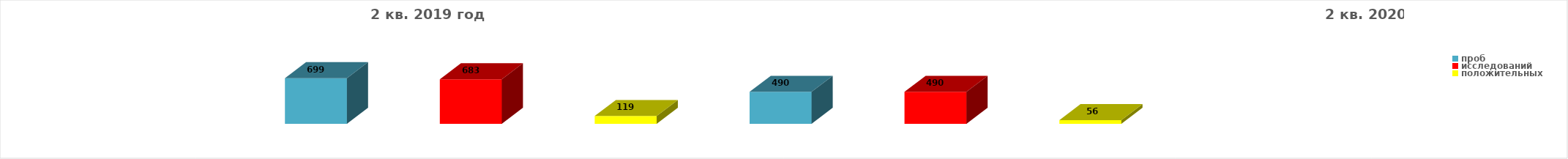
| Category | Series 4 |
|---|---|
| проб | 699 |
| исследований | 683 |
| положительных | 119 |
| проб | 490 |
| исследований | 490 |
| положительных | 56 |